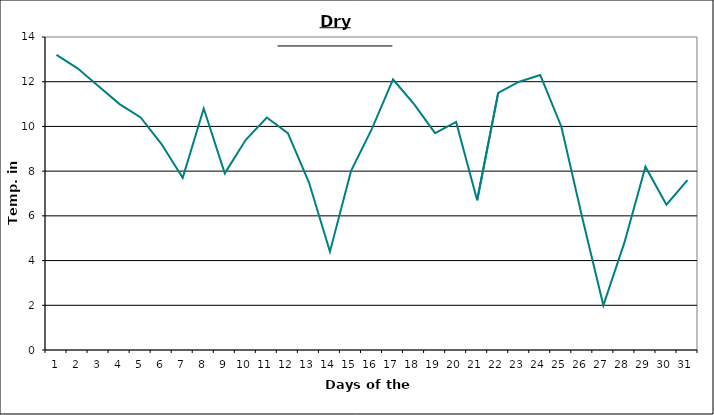
| Category | Series 0 |
|---|---|
| 0 | 13.2 |
| 1 | 12.6 |
| 2 | 11.8 |
| 3 | 11 |
| 4 | 10.4 |
| 5 | 9.2 |
| 6 | 7.7 |
| 7 | 10.8 |
| 8 | 7.9 |
| 9 | 9.4 |
| 10 | 10.4 |
| 11 | 9.7 |
| 12 | 7.5 |
| 13 | 4.4 |
| 14 | 8 |
| 15 | 9.9 |
| 16 | 12.1 |
| 17 | 11 |
| 18 | 9.7 |
| 19 | 10.2 |
| 20 | 6.7 |
| 21 | 11.5 |
| 22 | 12 |
| 23 | 12.3 |
| 24 | 10 |
| 25 | 5.9 |
| 26 | 2 |
| 27 | 4.8 |
| 28 | 8.2 |
| 29 | 6.5 |
| 30 | 7.6 |